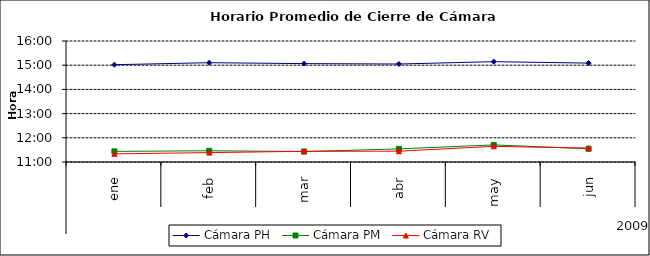
| Category | Cámara PH | Cámara PM | Cámara RV |
|---|---|---|---|
| 0 | 0.626 | 0.477 | 0.472 |
| 1 | 0.629 | 0.478 | 0.474 |
| 2 | 0.628 | 0.476 | 0.477 |
| 3 | 0.627 | 0.481 | 0.477 |
| 4 | 0.631 | 0.488 | 0.485 |
| 5 | 0.629 | 0.481 | 0.482 |